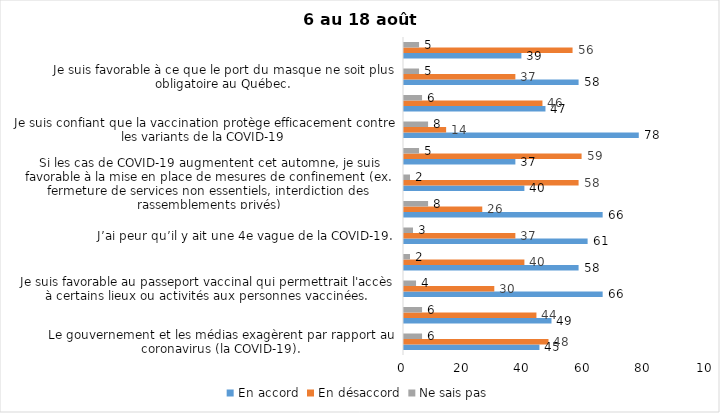
| Category | En accord | En désaccord | Ne sais pas |
|---|---|---|---|
| Le gouvernement et les médias exagèrent par rapport au coronavirus (la COVID-19). | 45 | 48 | 6 |
| J’ai peur que le système de santé soit débordé par les cas de COVID-19 suite au "déconfinement" | 49 | 44 | 6 |
| Je suis favorable au passeport vaccinal qui permettrait l'accès à certains lieux ou activités aux personnes vaccinées. | 66 | 30 | 4 |
| Malgré la levée des mesures de confinement, je préfère limiter mes contacts avec d’autres personnes (par ex., en évitant les activités sociales et de groupes) | 58 | 40 | 2 |
| J’ai peur qu’il y ait une 4e vague de la COVID-19. | 61 | 37 | 3 |
| Dans les régions en zone verte, le risque d’attraper la COVID-19 est minime. | 66 | 26 | 8 |
| Si les cas de COVID-19 augmentent cet automne, je suis favorable à la mise en place de mesures de confinement (ex. fermeture de services non essentiels, interdiction des rassemblements privés) | 40 | 58 | 2 |
| Je suis inquiet de contracter le variant Delta de la Covid-19 | 37 | 59 | 5 |
| Je suis confiant que la vaccination protège efficacement contre les variants de la COVID-19 | 78 | 14 | 8 |
| En raison de la baisse des cas de COID-19 je pense que le gouvernement du Québec devrait mettre fin à l’état d’urgence sanitaire | 47 | 46 | 6 |
| Je suis favorable à ce que le port du masque ne soit plus obligatoire au Québec. | 58 | 37 | 5 |
| Étant donné la progression de la vaccination, je pense qu’il est moins important de suivre les mesures de prévention. | 39 | 56 | 5 |